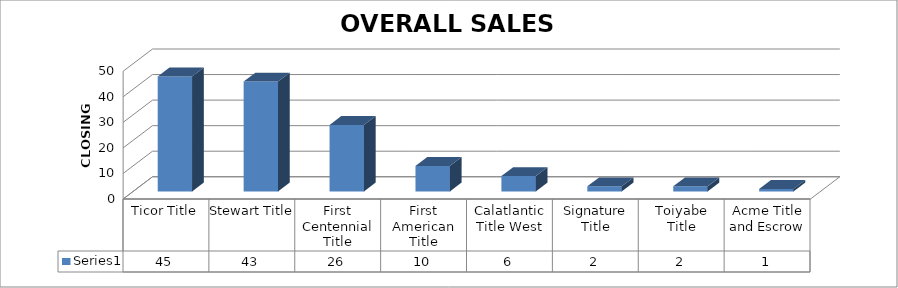
| Category | Series 0 |
|---|---|
| Ticor Title | 45 |
| Stewart Title | 43 |
| First Centennial Title | 26 |
| First American Title | 10 |
| Calatlantic Title West | 6 |
| Signature Title | 2 |
| Toiyabe Title | 2 |
| Acme Title and Escrow | 1 |